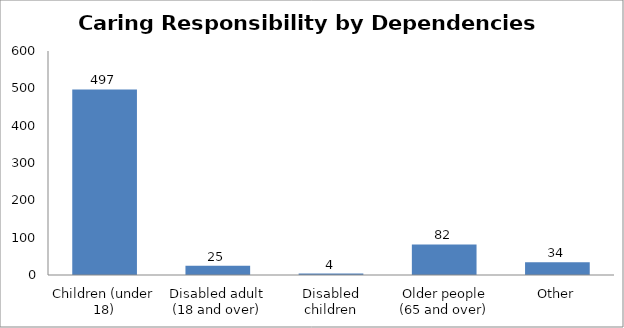
| Category | Total HC |
|---|---|
| Children (under 18) | 497 |
| Disabled adult (18 and over) | 25 |
| Disabled children | 4 |
| Older people (65 and over) | 82 |
| Other | 34 |